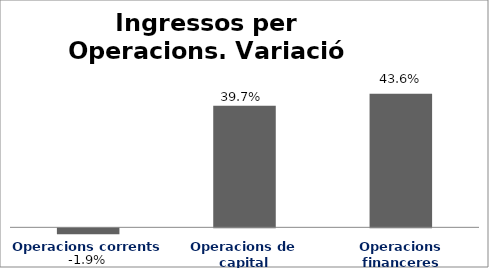
| Category | Series 0 |
|---|---|
| Operacions corrents | -0.019 |
| Operacions de capital | 0.397 |
| Operacions financeres | 0.436 |